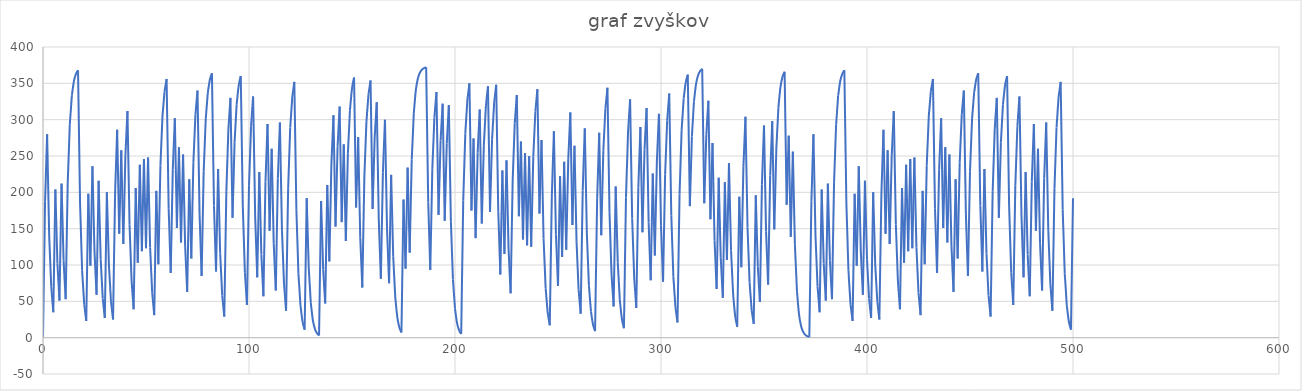
| Category | Series 0 |
|---|---|
| 0.0 | 1 |
| 1.0 | 187 |
| 2.0 | 280 |
| 3.0 | 140 |
| 4.0 | 70 |
| 5.0 | 35 |
| 6.0 | 204 |
| 7.0 | 102 |
| 8.0 | 51 |
| 9.0 | 212 |
| 10.0 | 106 |
| 11.0 | 53 |
| 12.0 | 213 |
| 13.0 | 293 |
| 14.0 | 333 |
| 15.0 | 353 |
| 16.0 | 363 |
| 17.0 | 368 |
| 18.0 | 184 |
| 19.0 | 92 |
| 20.0 | 46 |
| 21.0 | 23 |
| 22.0 | 198 |
| 23.0 | 99 |
| 24.0 | 236 |
| 25.0 | 118 |
| 26.0 | 59 |
| 27.0 | 216 |
| 28.0 | 108 |
| 29.0 | 54 |
| 30.0 | 27 |
| 31.0 | 200 |
| 32.0 | 100 |
| 33.0 | 50 |
| 34.0 | 25 |
| 35.0 | 199 |
| 36.0 | 286 |
| 37.0 | 143 |
| 38.0 | 258 |
| 39.0 | 129 |
| 40.0 | 251 |
| 41.0 | 312 |
| 42.0 | 156 |
| 43.0 | 78 |
| 44.0 | 39 |
| 45.0 | 206 |
| 46.0 | 103 |
| 47.0 | 238 |
| 48.0 | 119 |
| 49.0 | 246 |
| 50.0 | 123 |
| 51.0 | 248 |
| 52.0 | 124 |
| 53.0 | 62 |
| 54.0 | 31 |
| 55.0 | 202 |
| 56.0 | 101 |
| 57.0 | 237 |
| 58.0 | 305 |
| 59.0 | 339 |
| 60.0 | 356 |
| 61.0 | 178 |
| 62.0 | 89 |
| 63.0 | 231 |
| 64.0 | 302 |
| 65.0 | 151 |
| 66.0 | 262 |
| 67.0 | 131 |
| 68.0 | 252 |
| 69.0 | 126 |
| 70.0 | 63 |
| 71.0 | 218 |
| 72.0 | 109 |
| 73.0 | 241 |
| 74.0 | 307 |
| 75.0 | 340 |
| 76.0 | 170 |
| 77.0 | 85 |
| 78.0 | 229 |
| 79.0 | 301 |
| 80.0 | 337 |
| 81.0 | 355 |
| 82.0 | 364 |
| 83.0 | 182 |
| 84.0 | 91 |
| 85.0 | 232 |
| 86.0 | 116 |
| 87.0 | 58 |
| 88.0 | 29 |
| 89.0 | 201 |
| 90.0 | 287 |
| 91.0 | 330 |
| 92.0 | 165 |
| 93.0 | 269 |
| 94.0 | 321 |
| 95.0 | 347 |
| 96.0 | 360 |
| 97.0 | 180 |
| 98.0 | 90 |
| 99.0 | 45 |
| 100.0 | 209 |
| 101.0 | 291 |
| 102.0 | 332 |
| 103.0 | 166 |
| 104.0 | 83 |
| 105.0 | 228 |
| 106.0 | 114 |
| 107.0 | 57 |
| 108.0 | 215 |
| 109.0 | 294 |
| 110.0 | 147 |
| 111.0 | 260 |
| 112.0 | 130 |
| 113.0 | 65 |
| 114.0 | 219 |
| 115.0 | 296 |
| 116.0 | 148 |
| 117.0 | 74 |
| 118.0 | 37 |
| 119.0 | 205 |
| 120.0 | 289 |
| 121.0 | 331 |
| 122.0 | 352 |
| 123.0 | 176 |
| 124.0 | 88 |
| 125.0 | 44 |
| 126.0 | 22 |
| 127.0 | 11 |
| 128.0 | 192 |
| 129.0 | 96 |
| 130.0 | 48 |
| 131.0 | 24 |
| 132.0 | 12 |
| 133.0 | 6 |
| 134.0 | 3 |
| 135.0 | 188 |
| 136.0 | 94 |
| 137.0 | 47 |
| 138.0 | 210 |
| 139.0 | 105 |
| 140.0 | 239 |
| 141.0 | 306 |
| 142.0 | 153 |
| 143.0 | 263 |
| 144.0 | 318 |
| 145.0 | 159 |
| 146.0 | 266 |
| 147.0 | 133 |
| 148.0 | 253 |
| 149.0 | 313 |
| 150.0 | 343 |
| 151.0 | 358 |
| 152.0 | 179 |
| 153.0 | 276 |
| 154.0 | 138 |
| 155.0 | 69 |
| 156.0 | 221 |
| 157.0 | 297 |
| 158.0 | 335 |
| 159.0 | 354 |
| 160.0 | 177 |
| 161.0 | 275 |
| 162.0 | 324 |
| 163.0 | 162 |
| 164.0 | 81 |
| 165.0 | 227 |
| 166.0 | 300 |
| 167.0 | 150 |
| 168.0 | 75 |
| 169.0 | 224 |
| 170.0 | 112 |
| 171.0 | 56 |
| 172.0 | 28 |
| 173.0 | 14 |
| 174.0 | 7 |
| 175.0 | 190 |
| 176.0 | 95 |
| 177.0 | 234 |
| 178.0 | 117 |
| 179.0 | 245 |
| 180.0 | 309 |
| 181.0 | 341 |
| 182.0 | 357 |
| 183.0 | 365 |
| 184.0 | 369 |
| 185.0 | 371 |
| 186.0 | 372 |
| 187.0 | 186 |
| 188.0 | 93 |
| 189.0 | 233 |
| 190.0 | 303 |
| 191.0 | 338 |
| 192.0 | 169 |
| 193.0 | 271 |
| 194.0 | 322 |
| 195.0 | 161 |
| 196.0 | 267 |
| 197.0 | 320 |
| 198.0 | 160 |
| 199.0 | 80 |
| 200.0 | 40 |
| 201.0 | 20 |
| 202.0 | 10 |
| 203.0 | 5 |
| 204.0 | 189 |
| 205.0 | 281 |
| 206.0 | 327 |
| 207.0 | 350 |
| 208.0 | 175 |
| 209.0 | 274 |
| 210.0 | 137 |
| 211.0 | 255 |
| 212.0 | 314 |
| 213.0 | 157 |
| 214.0 | 265 |
| 215.0 | 319 |
| 216.0 | 346 |
| 217.0 | 173 |
| 218.0 | 273 |
| 219.0 | 323 |
| 220.0 | 348 |
| 221.0 | 174 |
| 222.0 | 87 |
| 223.0 | 230 |
| 224.0 | 115 |
| 225.0 | 244 |
| 226.0 | 122 |
| 227.0 | 61 |
| 228.0 | 217 |
| 229.0 | 295 |
| 230.0 | 334 |
| 231.0 | 167 |
| 232.0 | 270 |
| 233.0 | 135 |
| 234.0 | 254 |
| 235.0 | 127 |
| 236.0 | 250 |
| 237.0 | 125 |
| 238.0 | 249 |
| 239.0 | 311 |
| 240.0 | 342 |
| 241.0 | 171 |
| 242.0 | 272 |
| 243.0 | 136 |
| 244.0 | 68 |
| 245.0 | 34 |
| 246.0 | 17 |
| 247.0 | 195 |
| 248.0 | 284 |
| 249.0 | 142 |
| 250.0 | 71 |
| 251.0 | 222 |
| 252.0 | 111 |
| 253.0 | 242 |
| 254.0 | 121 |
| 255.0 | 247 |
| 256.0 | 310 |
| 257.0 | 155 |
| 258.0 | 264 |
| 259.0 | 132 |
| 260.0 | 66 |
| 261.0 | 33 |
| 262.0 | 203 |
| 263.0 | 288 |
| 264.0 | 144 |
| 265.0 | 72 |
| 266.0 | 36 |
| 267.0 | 18 |
| 268.0 | 9 |
| 269.0 | 191 |
| 270.0 | 282 |
| 271.0 | 141 |
| 272.0 | 257 |
| 273.0 | 315 |
| 274.0 | 344 |
| 275.0 | 172 |
| 276.0 | 86 |
| 277.0 | 43 |
| 278.0 | 208 |
| 279.0 | 104 |
| 280.0 | 52 |
| 281.0 | 26 |
| 282.0 | 13 |
| 283.0 | 193 |
| 284.0 | 283 |
| 285.0 | 328 |
| 286.0 | 164 |
| 287.0 | 82 |
| 288.0 | 41 |
| 289.0 | 207 |
| 290.0 | 290 |
| 291.0 | 145 |
| 292.0 | 259 |
| 293.0 | 316 |
| 294.0 | 158 |
| 295.0 | 79 |
| 296.0 | 226 |
| 297.0 | 113 |
| 298.0 | 243 |
| 299.0 | 308 |
| 300.0 | 154 |
| 301.0 | 77 |
| 302.0 | 225 |
| 303.0 | 299 |
| 304.0 | 336 |
| 305.0 | 168 |
| 306.0 | 84 |
| 307.0 | 42 |
| 308.0 | 21 |
| 309.0 | 197 |
| 310.0 | 285 |
| 311.0 | 329 |
| 312.0 | 351 |
| 313.0 | 362 |
| 314.0 | 181 |
| 315.0 | 277 |
| 316.0 | 325 |
| 317.0 | 349 |
| 318.0 | 361 |
| 319.0 | 367 |
| 320.0 | 370 |
| 321.0 | 185 |
| 322.0 | 279 |
| 323.0 | 326 |
| 324.0 | 163 |
| 325.0 | 268 |
| 326.0 | 134 |
| 327.0 | 67 |
| 328.0 | 220 |
| 329.0 | 110 |
| 330.0 | 55 |
| 331.0 | 214 |
| 332.0 | 107 |
| 333.0 | 240 |
| 334.0 | 120 |
| 335.0 | 60 |
| 336.0 | 30 |
| 337.0 | 15 |
| 338.0 | 194 |
| 339.0 | 97 |
| 340.0 | 235 |
| 341.0 | 304 |
| 342.0 | 152 |
| 343.0 | 76 |
| 344.0 | 38 |
| 345.0 | 19 |
| 346.0 | 196 |
| 347.0 | 98 |
| 348.0 | 49 |
| 349.0 | 211 |
| 350.0 | 292 |
| 351.0 | 146 |
| 352.0 | 73 |
| 353.0 | 223 |
| 354.0 | 298 |
| 355.0 | 149 |
| 356.0 | 261 |
| 357.0 | 317 |
| 358.0 | 345 |
| 359.0 | 359 |
| 360.0 | 366 |
| 361.0 | 183 |
| 362.0 | 278 |
| 363.0 | 139 |
| 364.0 | 256 |
| 365.0 | 128 |
| 366.0 | 64 |
| 367.0 | 32 |
| 368.0 | 16 |
| 369.0 | 8 |
| 370.0 | 4 |
| 371.0 | 2 |
| 372.0 | 1 |
| 373.0 | 187 |
| 374.0 | 280 |
| 375.0 | 140 |
| 376.0 | 70 |
| 377.0 | 35 |
| 378.0 | 204 |
| 379.0 | 102 |
| 380.0 | 51 |
| 381.0 | 212 |
| 382.0 | 106 |
| 383.0 | 53 |
| 384.0 | 213 |
| 385.0 | 293 |
| 386.0 | 333 |
| 387.0 | 353 |
| 388.0 | 363 |
| 389.0 | 368 |
| 390.0 | 184 |
| 391.0 | 92 |
| 392.0 | 46 |
| 393.0 | 23 |
| 394.0 | 198 |
| 395.0 | 99 |
| 396.0 | 236 |
| 397.0 | 118 |
| 398.0 | 59 |
| 399.0 | 216 |
| 400.0 | 108 |
| 401.0 | 54 |
| 402.0 | 27 |
| 403.0 | 200 |
| 404.0 | 100 |
| 405.0 | 50 |
| 406.0 | 25 |
| 407.0 | 199 |
| 408.0 | 286 |
| 409.0 | 143 |
| 410.0 | 258 |
| 411.0 | 129 |
| 412.0 | 251 |
| 413.0 | 312 |
| 414.0 | 156 |
| 415.0 | 78 |
| 416.0 | 39 |
| 417.0 | 206 |
| 418.0 | 103 |
| 419.0 | 238 |
| 420.0 | 119 |
| 421.0 | 246 |
| 422.0 | 123 |
| 423.0 | 248 |
| 424.0 | 124 |
| 425.0 | 62 |
| 426.0 | 31 |
| 427.0 | 202 |
| 428.0 | 101 |
| 429.0 | 237 |
| 430.0 | 305 |
| 431.0 | 339 |
| 432.0 | 356 |
| 433.0 | 178 |
| 434.0 | 89 |
| 435.0 | 231 |
| 436.0 | 302 |
| 437.0 | 151 |
| 438.0 | 262 |
| 439.0 | 131 |
| 440.0 | 252 |
| 441.0 | 126 |
| 442.0 | 63 |
| 443.0 | 218 |
| 444.0 | 109 |
| 445.0 | 241 |
| 446.0 | 307 |
| 447.0 | 340 |
| 448.0 | 170 |
| 449.0 | 85 |
| 450.0 | 229 |
| 451.0 | 301 |
| 452.0 | 337 |
| 453.0 | 355 |
| 454.0 | 364 |
| 455.0 | 182 |
| 456.0 | 91 |
| 457.0 | 232 |
| 458.0 | 116 |
| 459.0 | 58 |
| 460.0 | 29 |
| 461.0 | 201 |
| 462.0 | 287 |
| 463.0 | 330 |
| 464.0 | 165 |
| 465.0 | 269 |
| 466.0 | 321 |
| 467.0 | 347 |
| 468.0 | 360 |
| 469.0 | 180 |
| 470.0 | 90 |
| 471.0 | 45 |
| 472.0 | 209 |
| 473.0 | 291 |
| 474.0 | 332 |
| 475.0 | 166 |
| 476.0 | 83 |
| 477.0 | 228 |
| 478.0 | 114 |
| 479.0 | 57 |
| 480.0 | 215 |
| 481.0 | 294 |
| 482.0 | 147 |
| 483.0 | 260 |
| 484.0 | 130 |
| 485.0 | 65 |
| 486.0 | 219 |
| 487.0 | 296 |
| 488.0 | 148 |
| 489.0 | 74 |
| 490.0 | 37 |
| 491.0 | 205 |
| 492.0 | 289 |
| 493.0 | 331 |
| 494.0 | 352 |
| 495.0 | 176 |
| 496.0 | 88 |
| 497.0 | 44 |
| 498.0 | 22 |
| 499.0 | 11 |
| 500.0 | 192 |